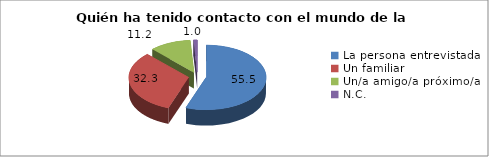
| Category | % |
|---|---|
| La persona entrevistada | 55.5 |
| Un familiar  | 32.3 |
| Un/a amigo/a próximo/a  | 11.2 |
| N.C. | 1 |